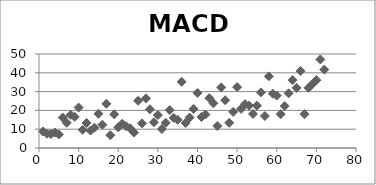
| Category | MACD |
|---|---|
| 1.0 | 8.8 |
| 2.0 | 7.6 |
| 3.0 | 7.4 |
| 4.0 | 8.2 |
| 5.0 | 7.2 |
| 6.0 | 16.2 |
| 7.0 | 13.4 |
| 8.0 | 17.6 |
| 9.0 | 16.6 |
| 10.0 | 21.5 |
| 11.0 | 9.7 |
| 12.0 | 13.3 |
| 13.0 | 9.3 |
| 14.0 | 10.8 |
| 15.0 | 18.2 |
| 16.0 | 12.4 |
| 17.0 | 23.5 |
| 18.0 | 6.8 |
| 19.0 | 17.9 |
| 20.0 | 11 |
| 21.0 | 12.9 |
| 22.0 | 11.6 |
| 23.0 | 10.5 |
| 24.0 | 8.2 |
| 25.0 | 25.1 |
| 26.0 | 13.1 |
| 27.0 | 26.4 |
| 28.0 | 20.6 |
| 29.0 | 13.7 |
| 30.0 | 17.5 |
| 31.0 | 10.1 |
| 32.0 | 13.4 |
| 33.0 | 20.2 |
| 34.0 | 16 |
| 35.0 | 15 |
| 36.0 | 35.2 |
| 37.0 | 13.3 |
| 38.0 | 16.2 |
| 39.0 | 20.8 |
| 40.0 | 29.3 |
| 41.0 | 16.5 |
| 42.0 | 17.8 |
| 43.0 | 26.5 |
| 44.0 | 23.8 |
| 45.0 | 11.7 |
| 46.0 | 32.2 |
| 47.0 | 25.4 |
| 48.0 | 13.4 |
| 49.0 | 19.2 |
| 50.0 | 32.4 |
| 51.0 | 20.8 |
| 52.0 | 23.3 |
| 53.0 | 22.5 |
| 54.0 | 18.1 |
| 55.0 | 22.5 |
| 56.0 | 29.6 |
| 57.0 | 17 |
| 58.0 | 38.1 |
| 59.0 | 28.9 |
| 60.0 | 27.9 |
| 61.0 | 18 |
| 62.0 | 22.3 |
| 63.0 | 29.1 |
| 64.0 | 36.1 |
| 65.0 | 32 |
| 66.0 | 41 |
| 67.0 | 18 |
| 68.0 | 32 |
| 69.0 | 34.1 |
| 70.0 | 36.1 |
| 71.0 | 47.1 |
| 72.0 | 41.7 |